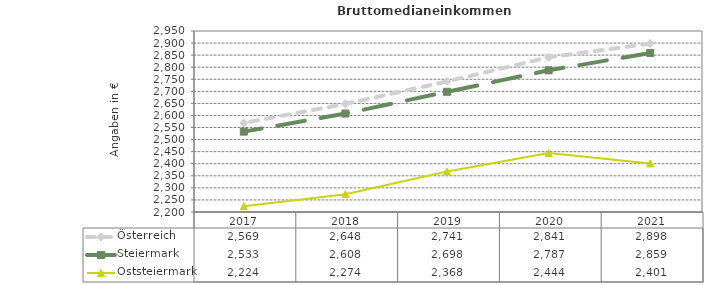
| Category | Österreich | Steiermark | Oststeiermark |
|---|---|---|---|
| 2021.0 | 2898 | 2859 | 2401 |
| 2020.0 | 2841 | 2787 | 2444 |
| 2019.0 | 2741 | 2698 | 2368 |
| 2018.0 | 2648 | 2608 | 2274 |
| 2017.0 | 2569 | 2533 | 2224 |